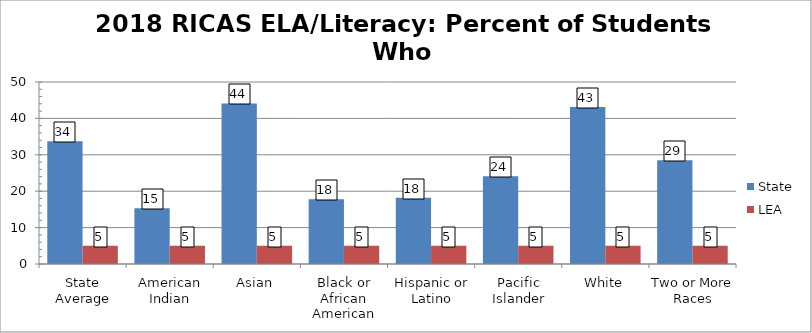
| Category | State | LEA |
|---|---|---|
| State Average | 33.7 | 5 |
| American Indian | 15.3 | 5 |
| Asian | 44.1 | 5 |
| Black or African American | 17.8 | 5 |
| Hispanic or Latino | 18.2 | 5 |
| Pacific Islander | 24.1 | 5 |
| White | 43.1 | 5 |
| Two or More Races | 28.5 | 5 |